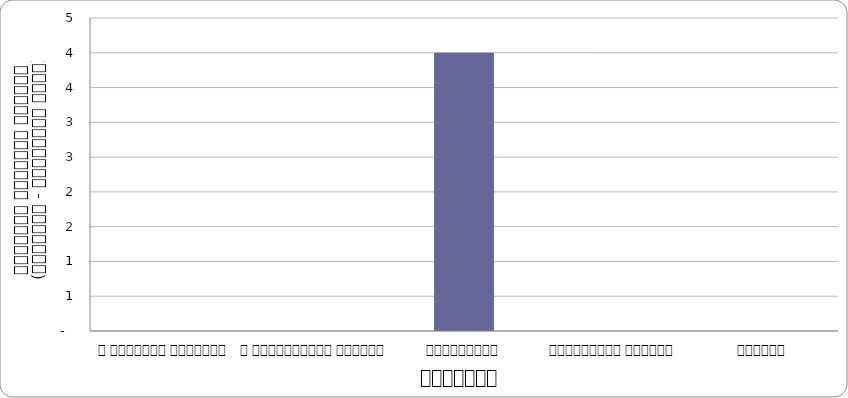
| Category | वातावरण |
|---|---|
| द हिमालयन टाइम्स् | 0 |
| द काठमाण्डौं पोस्ट् | 0 |
| कान्तिपुर | 4 |
| अन्नपूर्ण पोस्ट् | 0 |
| नागरिक | 0 |